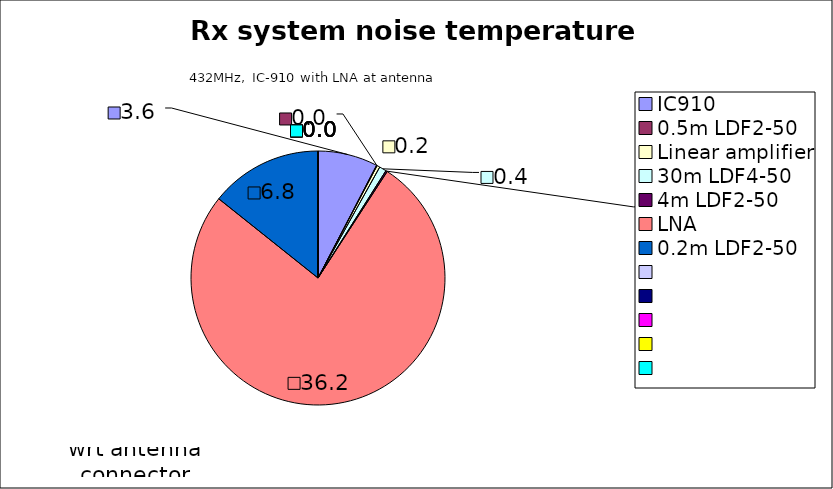
| Category | Series 0 |
|---|---|
| IC910 | 3.608 |
| 0.5m LDF2-50 | 0.038 |
| Linear amplifier | 0.177 |
| 30m LDF4-50 | 0.424 |
| 4m LDF2-50 | 0.091 |
| LNA | 36.21 |
| 0.2m LDF2-50 | 6.755 |